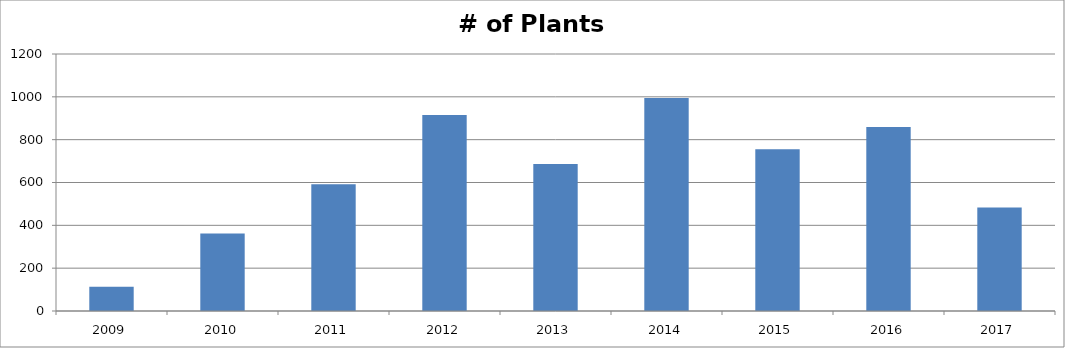
| Category | # of Plants Observed |
|---|---|
| 2009.0 | 113 |
| 2010.0 | 362 |
| 2011.0 | 592 |
| 2012.0 | 915 |
| 2013.0 | 686 |
| 2014.0 | 994 |
| 2015.0 | 755 |
| 2016.0 | 859 |
| 2017.0 | 483 |